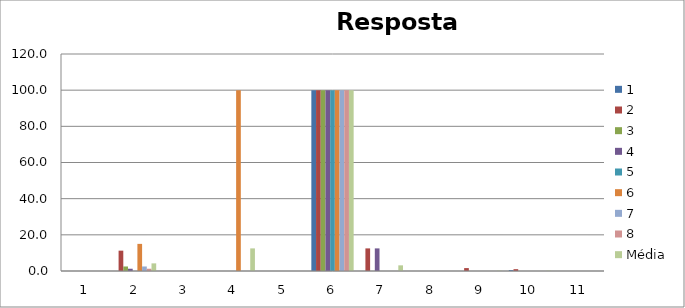
| Category | 1 | 2 | 3 | 4 | 5 | 6 | 7 | 8 | Média |
|---|---|---|---|---|---|---|---|---|---|
| 0 | 0 | 0 | 0 | 0 | 0 | 0 | 0 | 0 | 0 |
| 1 | 0 | 11.25 | 2.5 | 1.25 | 0 | 15 | 2.5 | 1.25 | 4.219 |
| 2 | 0 | 0 | 0 | 0 | 0 | 0 | 0 | 0 | 0 |
| 3 | 0 | 0 | 0 | 0 | 0 | 100 | 0 | 0 | 12.5 |
| 4 | 0 | 0 | 0 | 0 | 0 | 0 | 0 | 0 | 0 |
| 5 | 100 | 100 | 100 | 100 | 100 | 100 | 100 | 100 | 100 |
| 6 | 0 | 12.5 | 0 | 12.5 | 0 | 0 | 0 | 0 | 3.125 |
| 7 | 0 | 0 | 0 | 0 | 0 | 0 | 0 | 0 | 0 |
| 8 | 0 | 1.61 | 0 | 0 | 0 | 0 | 0 | 0 | 0.201 |
| 9 | 0.51 | 1.01 | 0 | 0 | 0 | 0 | 0 | 0 | 0.19 |
| 10 | 0 | 0 | 0 | 0 | 0 | 0 | 0 | 0 | 0 |